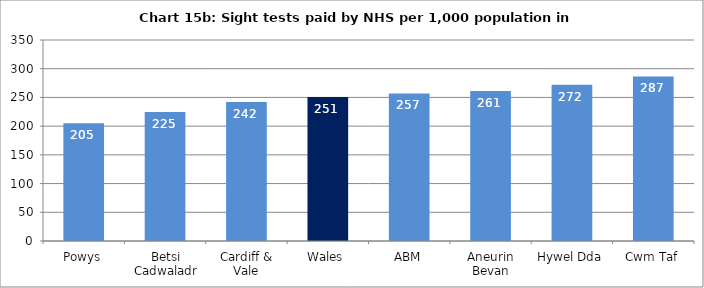
| Category | Chart 15b: Sight tests paid by NHS per 1,000 population in 2016-17 |
|---|---|
| Powys | 205.252 |
| Betsi Cadwaladr | 224.802 |
| Cardiff & Vale | 241.988 |
| Wales | 250.663 |
| ABM | 256.995 |
| Aneurin Bevan | 261.014 |
| Hywel Dda | 271.957 |
| Cwm Taf | 286.653 |